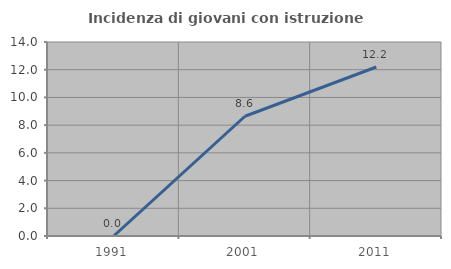
| Category | Incidenza di giovani con istruzione universitaria |
|---|---|
| 1991.0 | 0 |
| 2001.0 | 8.642 |
| 2011.0 | 12.195 |